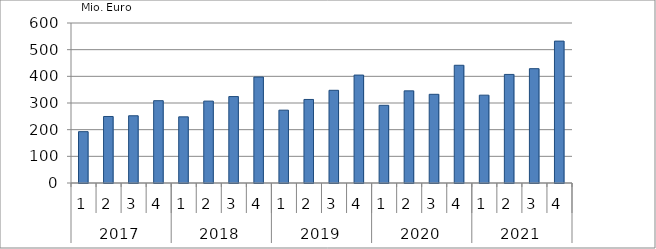
| Category | Ausbaugewerblicher Umsatz3 |
|---|---|
| 0 | 192499.539 |
| 1 | 249394.388 |
| 2 | 252146.755 |
| 3 | 308653.153 |
| 4 | 248133.418 |
| 5 | 307099.899 |
| 6 | 324088.989 |
| 7 | 397377.201 |
| 8 | 273159.137 |
| 9 | 313254.251 |
| 10 | 347631.281 |
| 11 | 404721.054 |
| 12 | 291272.144 |
| 13 | 345494.215 |
| 14 | 332629.265 |
| 15 | 441463.36 |
| 16 | 329380.212 |
| 17 | 407164.972 |
| 18 | 428783.222 |
| 19 | 532137.089 |